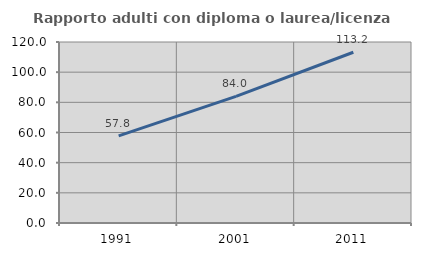
| Category | Rapporto adulti con diploma o laurea/licenza media  |
|---|---|
| 1991.0 | 57.81 |
| 2001.0 | 83.994 |
| 2011.0 | 113.195 |